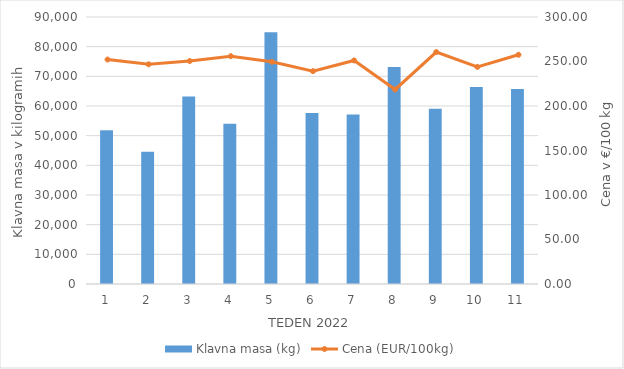
| Category | Klavna masa (kg) |
|---|---|
| 1.0 | 51818 |
| 2.0 | 44619 |
| 3.0 | 63233 |
| 4.0 | 53993 |
| 5.0 | 84871 |
| 6.0 | 57648 |
| 7.0 | 57159 |
| 8.0 | 73139 |
| 9.0 | 59056 |
| 10.0 | 66417 |
| 11.0 | 65723 |